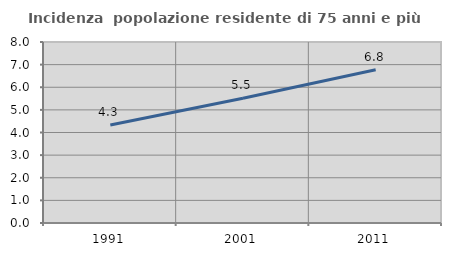
| Category | Incidenza  popolazione residente di 75 anni e più |
|---|---|
| 1991.0 | 4.329 |
| 2001.0 | 5.514 |
| 2011.0 | 6.775 |